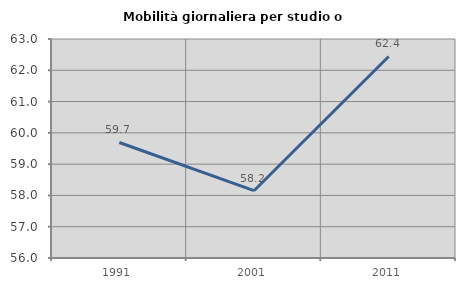
| Category | Mobilità giornaliera per studio o lavoro |
|---|---|
| 1991.0 | 59.692 |
| 2001.0 | 58.151 |
| 2011.0 | 62.441 |